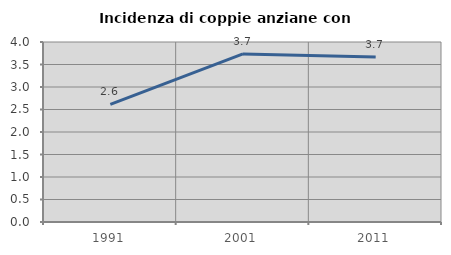
| Category | Incidenza di coppie anziane con figli |
|---|---|
| 1991.0 | 2.614 |
| 2001.0 | 3.734 |
| 2011.0 | 3.667 |